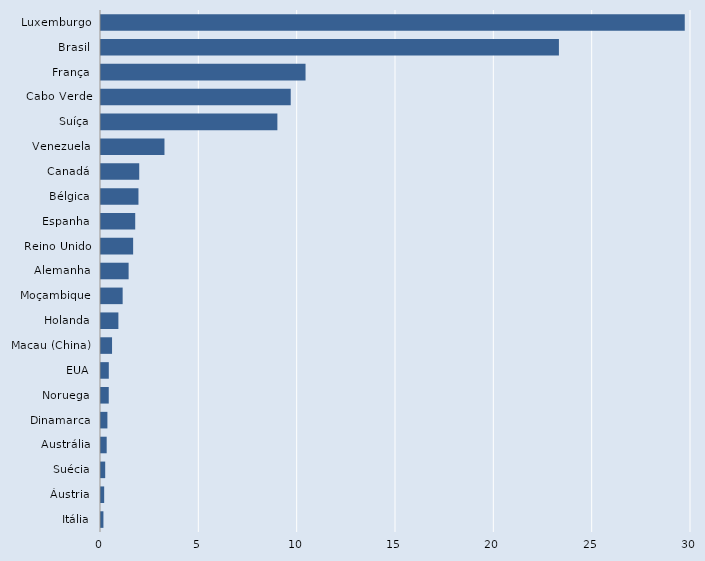
| Category | Series 0 |
|---|---|
| Itália | 0.123 |
| Áustria | 0.161 |
| Suécia | 0.214 |
| Austrália | 0.289 |
| Dinamarca | 0.326 |
| Noruega | 0.394 |
| EUA | 0.397 |
| Macau (China) | 0.562 |
| Holanda | 0.884 |
| Moçambique | 1.101 |
| Alemanha | 1.404 |
| Reino Unido | 1.634 |
| Espanha | 1.74 |
| Bélgica | 1.905 |
| Canadá | 1.944 |
| Venezuela | 3.227 |
| Suíça | 8.968 |
| Cabo Verde | 9.647 |
| França | 10.4 |
| Brasil | 23.284 |
| Luxemburgo | 29.682 |